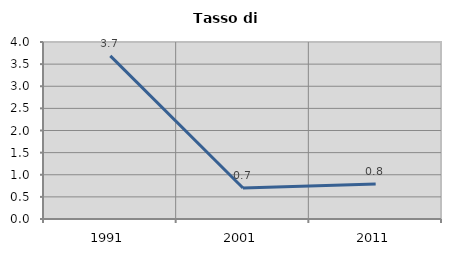
| Category | Tasso di disoccupazione   |
|---|---|
| 1991.0 | 3.686 |
| 2001.0 | 0.701 |
| 2011.0 | 0.789 |